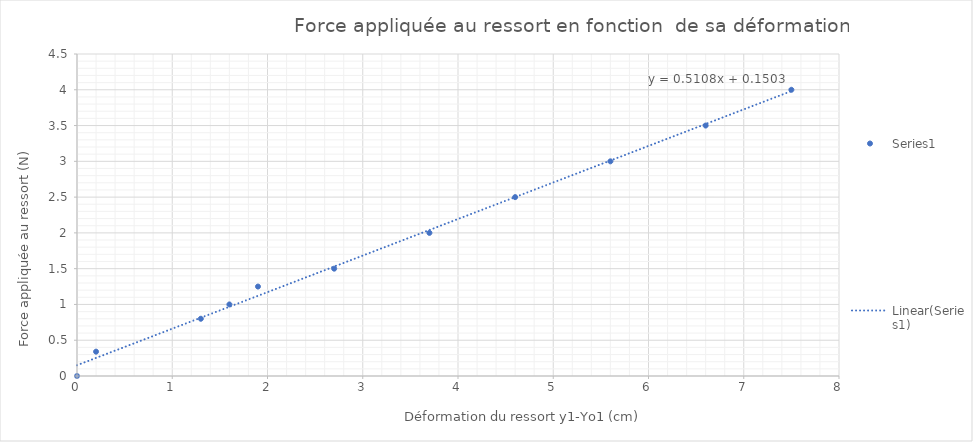
| Category | Series 0 |
|---|---|
| 0.2000000000000024 | 0.34 |
| 1.300000000000002 | 0.8 |
| 1.6000000000000028 | 1 |
| 1.9000000000000035 | 1.25 |
| 2.7000000000000024 | 1.5 |
| 3.7000000000000024 | 2 |
| 4.600000000000003 | 2.5 |
| 5.600000000000003 | 3 |
| 6.600000000000003 | 3.5 |
| 7.5000000000000036 | 4 |
| 0.0 | 0 |